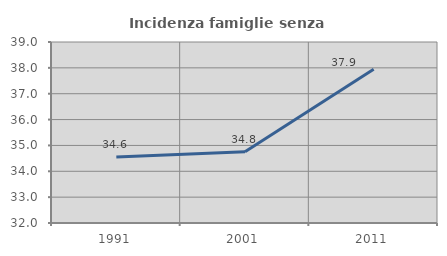
| Category | Incidenza famiglie senza nuclei |
|---|---|
| 1991.0 | 34.556 |
| 2001.0 | 34.752 |
| 2011.0 | 37.944 |